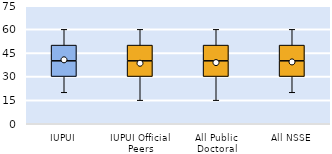
| Category | 25th | 50th | 75th |
|---|---|---|---|
| IUPUI | 30 | 10 | 10 |
| IUPUI Official Peers | 30 | 10 | 10 |
| All Public Doctoral | 30 | 10 | 10 |
| All NSSE | 30 | 10 | 10 |